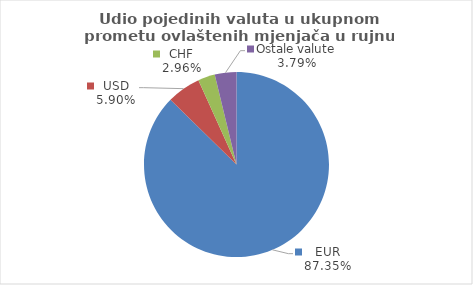
| Category | Series 0 |
|---|---|
| EUR | 87.349 |
| USD | 5.896 |
| CHF | 2.964 |
| Ostale valute | 3.79 |